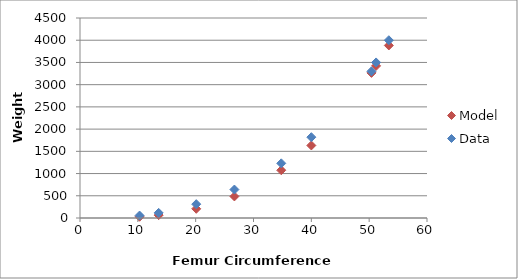
| Category | Model |
|---|---|
| 10.3 | 27.865 |
| 13.6 | 64.144 |
| 20.1 | 207.075 |
| 26.7 | 485.371 |
| 34.8 | 1074.677 |
| 40.0 | 1632 |
| 50.4 | 3264.614 |
| 51.2 | 3422.552 |
| 53.4 | 3882.969 |